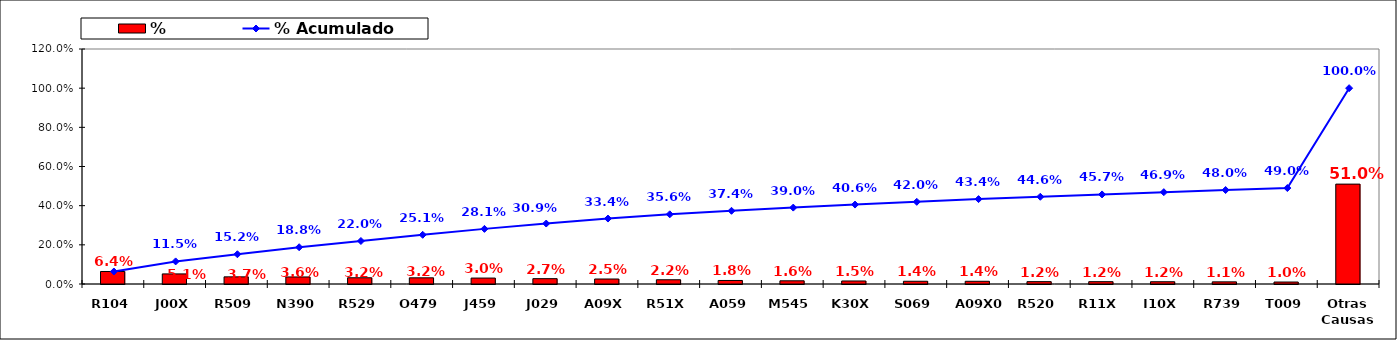
| Category | % |
|---|---|
| R104 | 0.064 |
| J00X | 0.051 |
| R509 | 0.037 |
| N390 | 0.036 |
| R529 | 0.032 |
| O479 | 0.032 |
| J459 | 0.03 |
| J029 | 0.027 |
| A09X | 0.025 |
| R51X | 0.022 |
| A059 | 0.018 |
| M545 | 0.016 |
| K30X | 0.015 |
| S069 | 0.014 |
| A09X0 | 0.014 |
| R520 | 0.012 |
| R11X | 0.012 |
| I10X | 0.012 |
| R739 | 0.011 |
| T009 | 0.01 |
| Otras Causas | 0.51 |